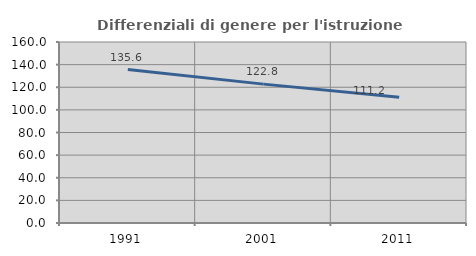
| Category | Differenziali di genere per l'istruzione superiore |
|---|---|
| 1991.0 | 135.606 |
| 2001.0 | 122.765 |
| 2011.0 | 111.243 |